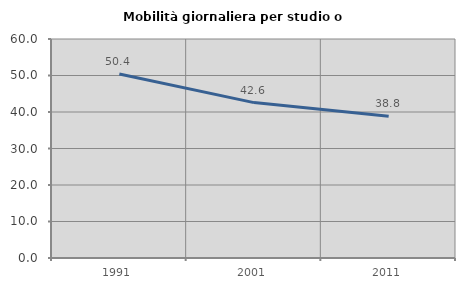
| Category | Mobilità giornaliera per studio o lavoro |
|---|---|
| 1991.0 | 50.43 |
| 2001.0 | 42.572 |
| 2011.0 | 38.806 |